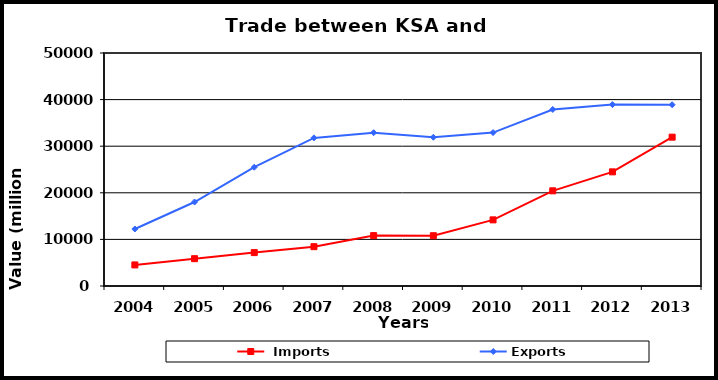
| Category |  Imports | Exports |
|---|---|---|
| 2004.0 | 4520 | 12230 |
| 2005.0 | 5862 | 18027 |
| 2006.0 | 7167 | 25488 |
| 2007.0 | 8437 | 31780 |
| 2008.0 | 10814 | 32900 |
| 2009.0 | 10790 | 31921 |
| 2010.0 | 14190 | 32923 |
| 2011.0 | 20426 | 37881 |
| 2012.0 | 24495 | 38927 |
| 2013.0 | 31940 | 38896 |